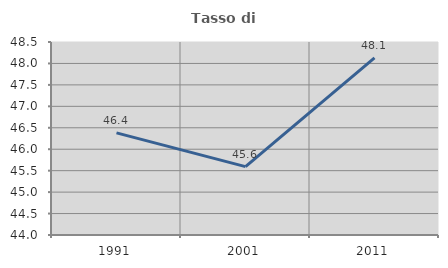
| Category | Tasso di occupazione   |
|---|---|
| 1991.0 | 46.381 |
| 2001.0 | 45.594 |
| 2011.0 | 48.128 |